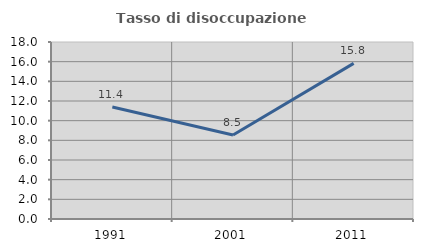
| Category | Tasso di disoccupazione giovanile  |
|---|---|
| 1991.0 | 11.384 |
| 2001.0 | 8.544 |
| 2011.0 | 15.824 |